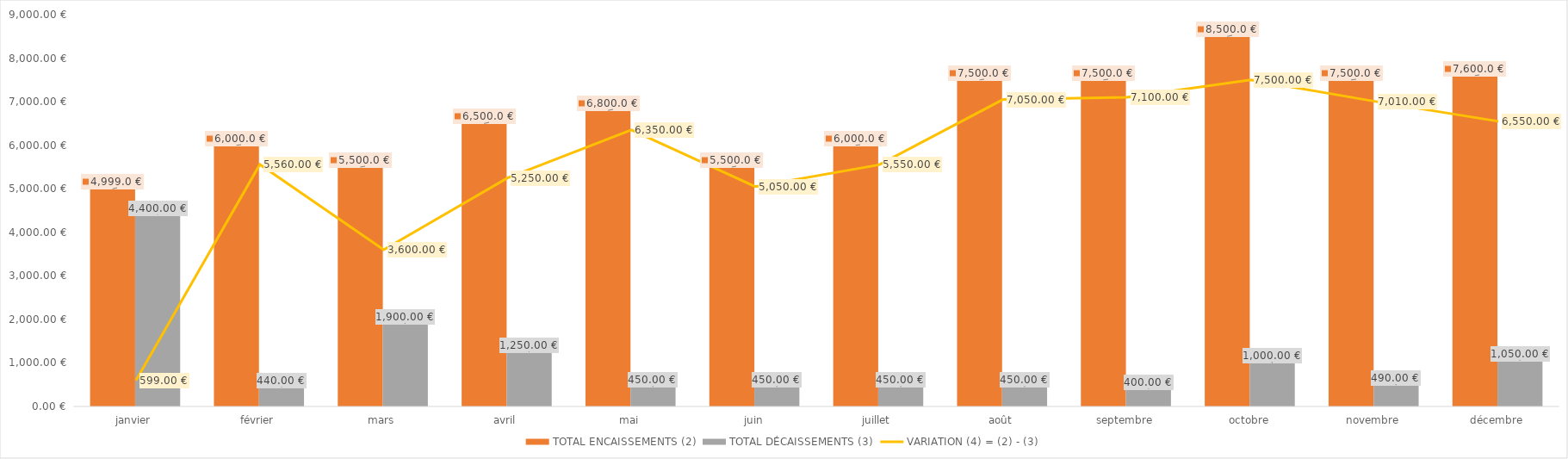
| Category | TOTAL ENCAISSEMENTS (2) | TOTAL DÉCAISSEMENTS (3) |
|---|---|---|
| janvier | 4999 | 4400 |
| février | 6000 | 440 |
| mars | 5500 | 1900 |
| avril | 6500 | 1250 |
| mai | 6800 | 450 |
| juin | 5500 | 450 |
| juillet | 6000 | 450 |
| août | 7500 | 450 |
| septembre | 7500 | 400 |
| octobre | 8500 | 1000 |
| novembre | 7500 | 490 |
| décembre | 7600 | 1050 |